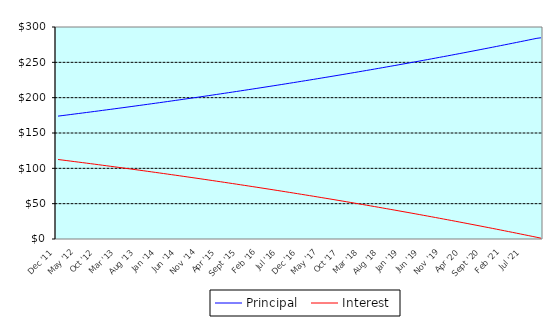
| Category | Principal | Interest |
|---|---|---|
| 0 | 173.88 | 112.5 |
| 1900-01-01 | 174.6 | 111.78 |
| 1900-01-02 | 175.33 | 111.05 |
| 1900-01-03 | 176.06 | 110.32 |
| 1900-01-04 | 176.8 | 109.58 |
| 1900-01-05 | 177.53 | 108.85 |
| 1900-01-06 | 178.27 | 108.11 |
| 1900-01-07 | 179.02 | 107.36 |
| 1900-01-08 | 179.76 | 106.62 |
| 1900-01-09 | 180.51 | 105.87 |
| 1900-01-10 | 181.26 | 105.12 |
| 1900-01-11 | 182.02 | 104.36 |
| 1900-01-12 | 182.78 | 103.6 |
| 1900-01-13 | 183.54 | 102.84 |
| 1900-01-14 | 184.3 | 102.08 |
| 1900-01-15 | 185.07 | 101.31 |
| 1900-01-16 | 185.84 | 100.54 |
| 1900-01-17 | 186.62 | 99.76 |
| 1900-01-18 | 187.39 | 98.99 |
| 1900-01-19 | 188.17 | 98.21 |
| 1900-01-20 | 188.96 | 97.42 |
| 1900-01-21 | 189.75 | 96.63 |
| 1900-01-22 | 190.54 | 95.84 |
| 1900-01-23 | 191.33 | 95.05 |
| 1900-01-24 | 192.13 | 94.25 |
| 1900-01-25 | 192.93 | 93.45 |
| 1900-01-26 | 193.73 | 92.65 |
| 1900-01-27 | 194.54 | 91.84 |
| 1900-01-28 | 195.35 | 91.03 |
| 1900-01-29 | 196.16 | 90.22 |
| 1900-01-30 | 196.98 | 89.4 |
| 1900-01-31 | 197.8 | 88.58 |
| 1900-02-01 | 198.63 | 87.75 |
| 1900-02-02 | 199.45 | 86.93 |
| 1900-02-03 | 200.28 | 86.1 |
| 1900-02-04 | 201.12 | 85.26 |
| 1900-02-05 | 201.96 | 84.42 |
| 1900-02-06 | 202.8 | 83.58 |
| 1900-02-07 | 203.64 | 82.74 |
| 1900-02-08 | 204.49 | 81.89 |
| 1900-02-09 | 205.34 | 81.04 |
| 1900-02-10 | 206.2 | 80.18 |
| 1900-02-11 | 207.06 | 79.32 |
| 1900-02-12 | 207.92 | 78.46 |
| 1900-02-13 | 208.79 | 77.59 |
| 1900-02-14 | 209.66 | 76.72 |
| 1900-02-15 | 210.53 | 75.85 |
| 1900-02-16 | 211.41 | 74.97 |
| 1900-02-17 | 212.29 | 74.09 |
| 1900-02-18 | 213.17 | 73.21 |
| 1900-02-19 | 214.06 | 72.32 |
| 1900-02-20 | 214.95 | 71.43 |
| 1900-02-21 | 215.85 | 70.53 |
| 1900-02-22 | 216.75 | 69.63 |
| 1900-02-23 | 217.65 | 68.73 |
| 1900-02-24 | 218.56 | 67.82 |
| 1900-02-25 | 219.47 | 66.91 |
| 1900-02-26 | 220.38 | 66 |
| 1900-02-27 | 221.3 | 65.08 |
| 1900-02-28 | 222.22 | 64.16 |
| 1900-02-28 | 223.15 | 63.23 |
| 1900-03-01 | 224.08 | 62.3 |
| 1900-03-02 | 225.01 | 61.37 |
| 1900-03-03 | 225.95 | 60.43 |
| 1900-03-04 | 226.89 | 59.49 |
| 1900-03-05 | 227.84 | 58.54 |
| 1900-03-06 | 228.79 | 57.59 |
| 1900-03-07 | 229.74 | 56.64 |
| 1900-03-08 | 230.7 | 55.68 |
| 1900-03-09 | 231.66 | 54.72 |
| 1900-03-10 | 232.62 | 53.76 |
| 1900-03-11 | 233.59 | 52.79 |
| 1900-03-12 | 234.57 | 51.81 |
| 1900-03-13 | 235.54 | 50.84 |
| 1900-03-14 | 236.53 | 49.85 |
| 1900-03-15 | 237.51 | 48.87 |
| 1900-03-16 | 238.5 | 47.88 |
| 1900-03-17 | 239.49 | 46.89 |
| 1900-03-18 | 240.49 | 45.89 |
| 1900-03-19 | 241.49 | 44.89 |
| 1900-03-20 | 242.5 | 43.88 |
| 1900-03-21 | 243.51 | 42.87 |
| 1900-03-22 | 244.53 | 41.85 |
| 1900-03-23 | 245.54 | 40.84 |
| 1900-03-24 | 246.57 | 39.81 |
| 1900-03-25 | 247.6 | 38.78 |
| 1900-03-26 | 248.63 | 37.75 |
| 1900-03-27 | 249.66 | 36.72 |
| 1900-03-28 | 250.7 | 35.68 |
| 1900-03-29 | 251.75 | 34.63 |
| 1900-03-30 | 252.8 | 33.58 |
| 1900-03-31 | 253.85 | 32.53 |
| 1900-04-01 | 254.91 | 31.47 |
| 1900-04-02 | 255.97 | 30.41 |
| 1900-04-03 | 257.04 | 29.34 |
| 1900-04-04 | 258.11 | 28.27 |
| 1900-04-05 | 259.18 | 27.2 |
| 1900-04-06 | 260.26 | 26.12 |
| 1900-04-07 | 261.35 | 25.03 |
| 1900-04-08 | 262.44 | 23.94 |
| 1900-04-09 | 263.53 | 22.85 |
| 1900-04-10 | 264.63 | 21.75 |
| 1900-04-11 | 265.73 | 20.65 |
| 1900-04-12 | 266.84 | 19.54 |
| 1900-04-13 | 267.95 | 18.43 |
| 1900-04-14 | 269.07 | 17.31 |
| 1900-04-15 | 270.19 | 16.19 |
| 1900-04-16 | 271.31 | 15.07 |
| 1900-04-17 | 272.44 | 13.94 |
| 1900-04-18 | 273.58 | 12.8 |
| 1900-04-19 | 274.72 | 11.66 |
| 1900-04-20 | 275.86 | 10.52 |
| 1900-04-21 | 277.01 | 9.37 |
| 1900-04-22 | 278.17 | 8.21 |
| 1900-04-23 | 279.33 | 7.05 |
| 1900-04-24 | 280.49 | 5.89 |
| 1900-04-25 | 281.66 | 4.72 |
| 1900-04-26 | 282.83 | 3.55 |
| 1900-04-27 | 284.01 | 2.37 |
| 1900-04-28 | 284.73 | 1.19 |